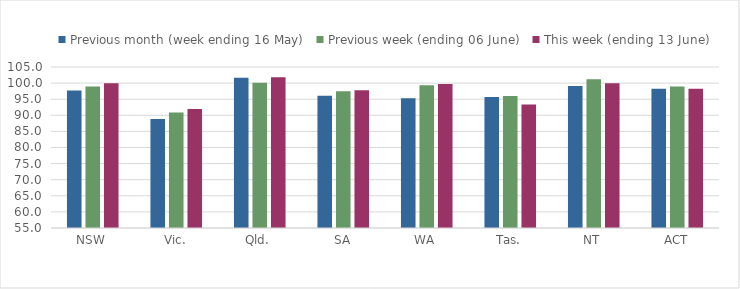
| Category | Previous month (week ending 16 May) | Previous week (ending 06 June) | This week (ending 13 June) |
|---|---|---|---|
| NSW | 97.669 | 98.906 | 99.952 |
| Vic. | 88.864 | 90.883 | 91.967 |
| Qld. | 101.692 | 100.124 | 101.782 |
| SA | 96.075 | 97.489 | 97.781 |
| WA | 95.31 | 99.344 | 99.752 |
| Tas. | 95.703 | 95.999 | 93.373 |
| NT | 99.07 | 101.172 | 99.975 |
| ACT | 98.275 | 98.968 | 98.21 |